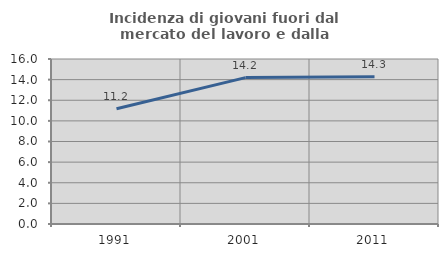
| Category | Incidenza di giovani fuori dal mercato del lavoro e dalla formazione  |
|---|---|
| 1991.0 | 11.169 |
| 2001.0 | 14.196 |
| 2011.0 | 14.286 |